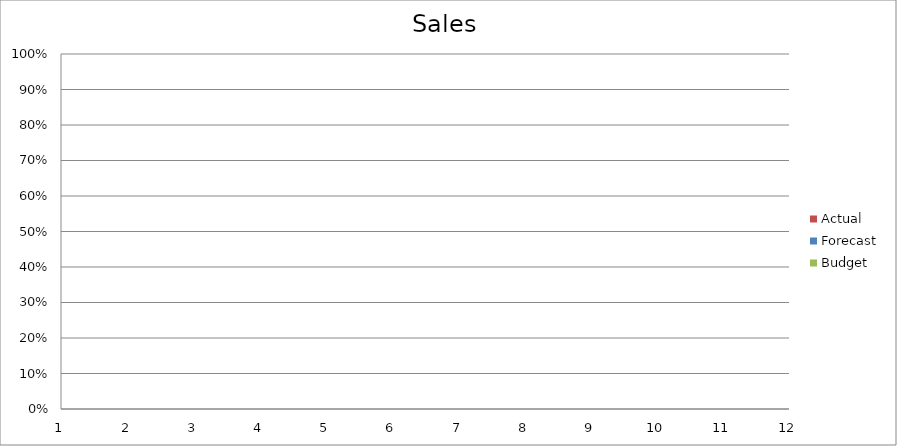
| Category | Budget | Forecast | Actual |
|---|---|---|---|
| 0 | 3370 | 1440 | 3170 |
| 1 | 930 | 1760 | 2670 |
| 2 | 1640 | 2640 | 1140 |
| 3 | 2000 | 1070 | 810 |
| 4 | 1690 | 860 | 1220 |
| 5 | 2630 | 1130 | 1740 |
| 6 | 2790 | 1450 | 3370 |
| 7 | 2010 | 2280 | 1200 |
| 8 | 1750 | 2100 | 1800 |
| 9 | 1250 | 1970 | 1360 |
| 10 | 1880 | 3380 | 2860 |
| 11 | 630 | 640 | 1720 |